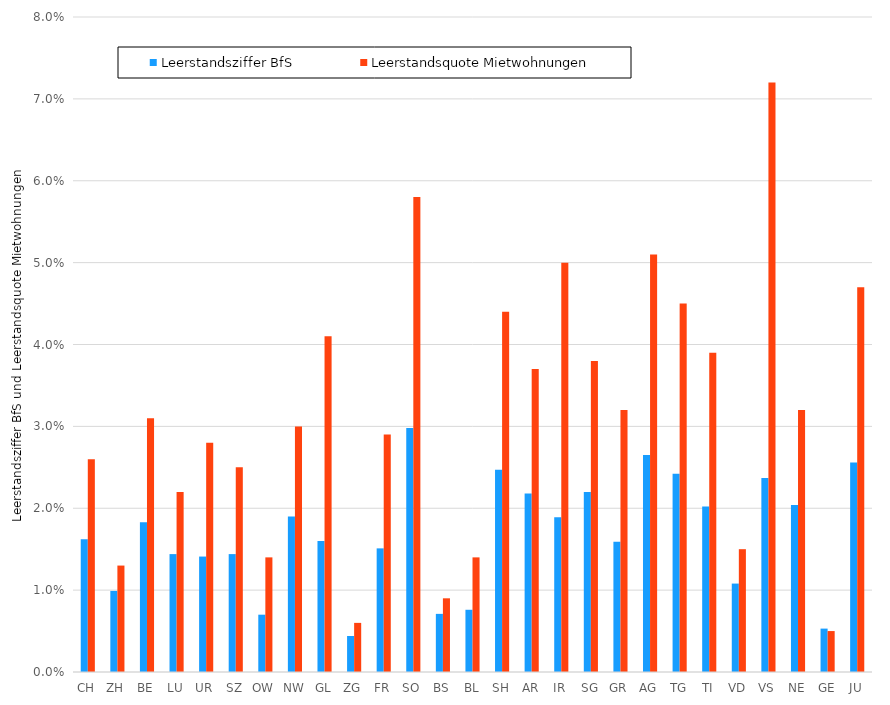
| Category | Leerstandsziffer BfS | Leerstandsquote Mietwohnungen |
|---|---|---|
| CH | 0.016 | 0.026 |
| ZH | 0.01 | 0.013 |
| BE | 0.018 | 0.031 |
| LU | 0.014 | 0.022 |
| UR | 0.014 | 0.028 |
| SZ | 0.014 | 0.025 |
| OW | 0.007 | 0.014 |
| NW | 0.019 | 0.03 |
| GL | 0.016 | 0.041 |
| ZG | 0.004 | 0.006 |
| FR | 0.015 | 0.029 |
| SO | 0.03 | 0.058 |
| BS | 0.007 | 0.009 |
| BL | 0.008 | 0.014 |
| SH | 0.025 | 0.044 |
| AR | 0.022 | 0.037 |
| IR | 0.019 | 0.05 |
| SG | 0.022 | 0.038 |
| GR | 0.016 | 0.032 |
| AG | 0.026 | 0.051 |
| TG | 0.024 | 0.045 |
| TI | 0.02 | 0.039 |
| VD | 0.011 | 0.015 |
| VS | 0.024 | 0.072 |
| NE | 0.02 | 0.032 |
| GE | 0.005 | 0.005 |
| JU | 0.026 | 0.047 |